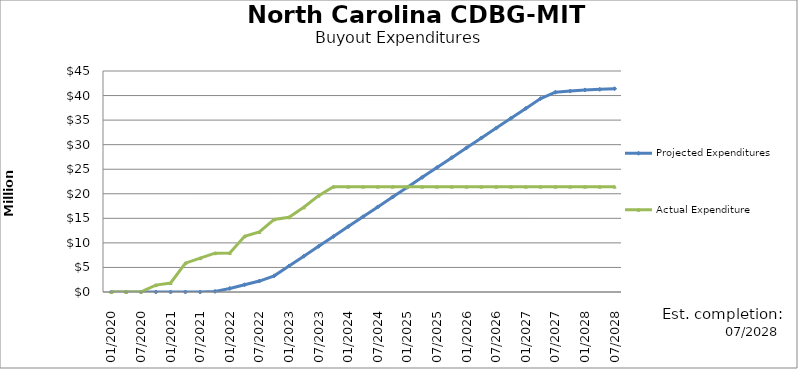
| Category | Projected Expenditures | Actual Expenditure |
|---|---|---|
| 01/2020 | 0 | 0 |
| 04/2020 | 0 | 0 |
| 07/2020 | 0 | 51196.5 |
| 10/2020 | 0 | 1396995.41 |
| 01/2021 | 0 | 1828831.36 |
| 04/2021 | 0 | 5869022.93 |
| 07/2021 | 0 | 6889035.93 |
| 10/2021 | 125000 | 7903076.08 |
| 01/2022 | 725000 | 7944165.05 |
| 04/2022 | 1475000 | 11338167.15 |
| 07/2022 | 2225000 | 12222903.41 |
| 10/2022 | 3285000 | 14775198.96 |
| 01/2023 | 5290848.136 | 15211645.54 |
| 04/2023 | 7296696.272 | 17252233.6 |
| 07/2023 | 9302544.409 | 19618576.57 |
| 10/2023 | 11308392.545 | 21450318.07 |
| 01/2024 | 13314240.681 | 21450318.07 |
| 04/2024 | 15320088.817 | 21450318.07 |
| 07/2024 | 17325936.953 | 21450318.07 |
| 10/2024 | 19331785.09 | 21450318.07 |
| 01/2025 | 21337633.226 | 21450318.07 |
| 04/2025 | 23343481.362 | 21450318.07 |
| 07/2025 | 25349329.498 | 21450318.07 |
| 10/2025 | 27355177.634 | 21450318.07 |
| 01/2026 | 29361025.77 | 21450318.07 |
| 04/2026 | 31366873.907 | 21450318.07 |
| 07/2026 | 33372722.043 | 21450318.07 |
| 10/2026 | 35378570.179 | 21450318.07 |
| 01/2027 | 37384418.315 | 21450318.07 |
| 04/2027 | 39390266.451 | 21450318.07 |
| 07/2027 | 40680959.451 | 21450318.07 |
| 10/2027 | 40913046.121 | 21450318.07 |
| 01/2028 | 41145132.791 | 21450318.07 |
| 04/2028 | 41261175.791 | 21450318.07 |
| 07/2028 | 41391773.126 | 21450318.07 |